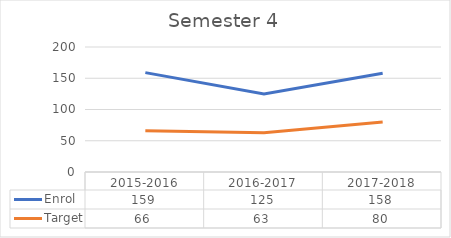
| Category | Enrol | Target |
|---|---|---|
| 2015-2016 | 159 | 66 |
| 2016-2017 | 125 | 63 |
| 2017-2018 | 158 | 80 |